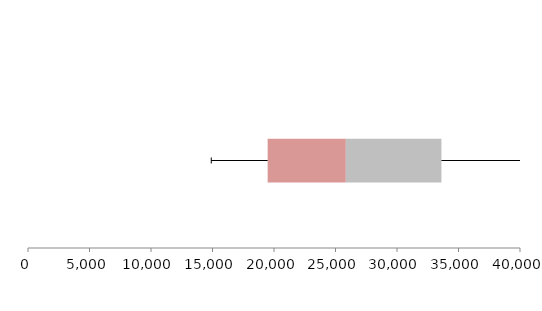
| Category | Series 1 | Series 2 | Series 3 |
|---|---|---|---|
| 0 | 19483.984 | 6356.884 | 7770.364 |